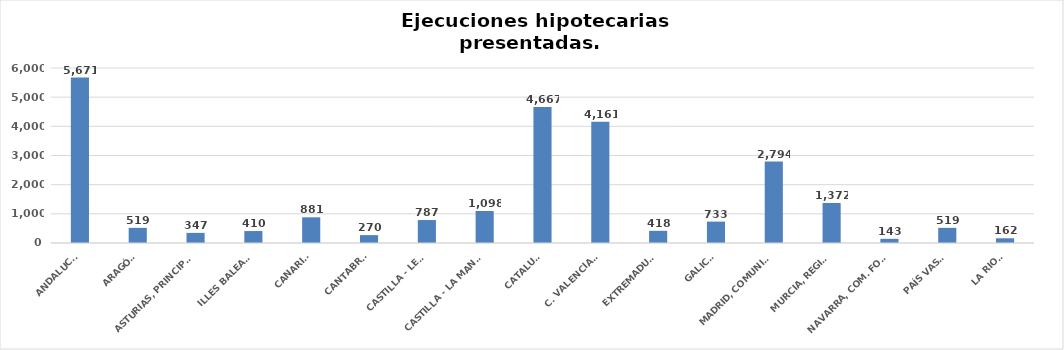
| Category | Series 0 |
|---|---|
| ANDALUCÍA | 5671 |
| ARAGÓN | 519 |
| ASTURIAS, PRINCIPADO | 347 |
| ILLES BALEARS | 410 |
| CANARIAS | 881 |
| CANTABRIA | 270 |
| CASTILLA - LEÓN | 787 |
| CASTILLA - LA MANCHA | 1098 |
| CATALUÑA | 4667 |
| C. VALENCIANA | 4161 |
| EXTREMADURA | 418 |
| GALICIA | 733 |
| MADRID, COMUNIDAD | 2794 |
| MURCIA, REGIÓN | 1372 |
| NAVARRA, COM. FORAL | 143 |
| PAÍS VASCO | 519 |
| LA RIOJA | 162 |